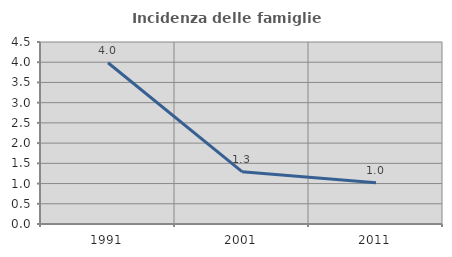
| Category | Incidenza delle famiglie numerose |
|---|---|
| 1991.0 | 3.986 |
| 2001.0 | 1.294 |
| 2011.0 | 1.02 |